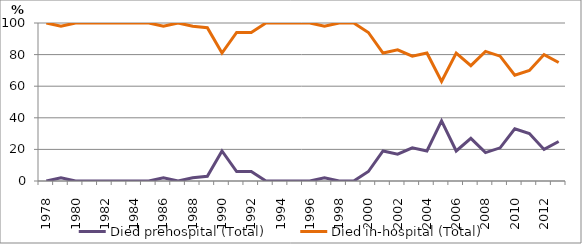
| Category | Died prehospital (Total) | Died in-hospital (Total) |
|---|---|---|
| 1978.0 | 0 | 100 |
| 1979.0 | 2 | 98 |
| 1980.0 | 0 | 100 |
| 1981.0 | 0 | 100 |
| 1982.0 | 0 | 100 |
| 1983.0 | 0 | 100 |
| 1984.0 | 0 | 100 |
| 1985.0 | 0 | 100 |
| 1986.0 | 2 | 98 |
| 1987.0 | 0 | 100 |
| 1988.0 | 2 | 98 |
| 1989.0 | 3 | 97 |
| 1990.0 | 19 | 81 |
| 1991.0 | 6 | 94 |
| 1992.0 | 6 | 94 |
| 1993.0 | 0 | 100 |
| 1994.0 | 0 | 100 |
| 1995.0 | 0 | 100 |
| 1996.0 | 0 | 100 |
| 1997.0 | 2 | 98 |
| 1998.0 | 0 | 100 |
| 1999.0 | 0 | 100 |
| 2000.0 | 6 | 94 |
| 2001.0 | 19 | 81 |
| 2002.0 | 17 | 83 |
| 2003.0 | 21 | 79 |
| 2004.0 | 19 | 81 |
| 2005.0 | 38 | 63 |
| 2006.0 | 19 | 81 |
| 2007.0 | 27 | 73 |
| 2008.0 | 18 | 82 |
| 2009.0 | 21 | 79 |
| 2010.0 | 33 | 67 |
| 2011.0 | 30 | 70 |
| 2012.0 | 20 | 80 |
| 2013.0 | 25 | 75 |